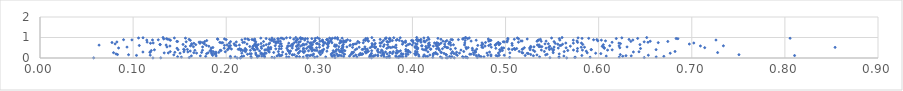
| Category | Series 0 |
|---|---|
| 0.2118543396008956 | 0.001 |
| 0.12129331327924464 | 0.002 |
| 0.21503471397023466 | 0.003 |
| 0.565711948898749 | 0.004 |
| 0.4317880717832856 | 0.005 |
| 0.057658690252793465 | 0.006 |
| 0.12973322363064155 | 0.007 |
| 0.44494189452631794 | 0.008 |
| 0.43621252997750537 | 0.009 |
| 0.2872661492622278 | 0.01 |
| 0.35607231722096055 | 0.011 |
| 0.547665336929914 | 0.012 |
| 0.4376710667148568 | 0.013 |
| 0.20470736708723236 | 0.014 |
| 0.4591225750260366 | 0.015 |
| 0.25174165239626 | 0.016 |
| 0.3168722514484781 | 0.017 |
| 0.21560596720742287 | 0.018 |
| 0.22693069176083858 | 0.019 |
| 0.16028587518891257 | 0.02 |
| 0.6489664209803414 | 0.021 |
| 0.4696963692293614 | 0.022 |
| 0.44119050889169076 | 0.023 |
| 0.3852339358780903 | 0.024 |
| 0.45463928858940317 | 0.025 |
| 0.3722078880253269 | 0.026 |
| 0.5044030828282321 | 0.027 |
| 0.375543780716866 | 0.028 |
| 0.5574835376465481 | 0.029 |
| 0.5743117218151931 | 0.03 |
| 0.4218886666890791 | 0.031 |
| 0.458367266610329 | 0.032 |
| 0.29505251293612056 | 0.033 |
| 0.5749159363888 | 0.034 |
| 0.24908869583206206 | 0.035 |
| 0.37386169035850947 | 0.036 |
| 0.5908239363297277 | 0.037 |
| 0.2334012408853079 | 0.038 |
| 0.3834502119157547 | 0.039 |
| 0.45692004560620847 | 0.04 |
| 0.15187447150669886 | 0.041 |
| 0.35392087247951287 | 0.042 |
| 0.6220308373638864 | 0.043 |
| 0.2827132019953973 | 0.044 |
| 0.24127367880391326 | 0.045 |
| 0.26483543574273616 | 0.046 |
| 0.3404484344927873 | 0.047 |
| 0.267339425217921 | 0.048 |
| 0.5574039925854366 | 0.049 |
| 0.430064651710236 | 0.05 |
| 0.30685046242236724 | 0.051 |
| 0.5365470671737739 | 0.052 |
| 0.661766917246885 | 0.053 |
| 0.4573908222730908 | 0.054 |
| 0.3894773188964096 | 0.055 |
| 0.20958990796429655 | 0.056 |
| 0.27529819331653327 | 0.057 |
| 0.4768359060287244 | 0.058 |
| 0.3695365599015791 | 0.059 |
| 0.38229908088392295 | 0.06 |
| 0.2164743538229993 | 0.061 |
| 0.14779102306572223 | 0.062 |
| 0.27869391100561847 | 0.063 |
| 0.4737805872930966 | 0.064 |
| 0.4538445014751191 | 0.065 |
| 0.29768051933521444 | 0.066 |
| 0.4424034812235781 | 0.067 |
| 0.326089384239017 | 0.068 |
| 0.31393656928011826 | 0.069 |
| 0.38763195198086153 | 0.07 |
| 0.2167980460928749 | 0.071 |
| 0.22653029826593363 | 0.072 |
| 0.35830620600344565 | 0.073 |
| 0.4117198485724607 | 0.074 |
| 0.4399375363958521 | 0.075 |
| 0.17793064280056137 | 0.076 |
| 0.4163260286040763 | 0.077 |
| 0.20449137725581024 | 0.078 |
| 0.4143998056783976 | 0.079 |
| 0.6699984778916008 | 0.08 |
| 0.47240549796858866 | 0.081 |
| 0.35475444166449377 | 0.082 |
| 0.625865923188232 | 0.083 |
| 0.2757556662461156 | 0.084 |
| 0.393139308548596 | 0.085 |
| 0.40705151198399014 | 0.086 |
| 0.3323216711928294 | 0.087 |
| 0.24110103758072388 | 0.088 |
| 0.23826304916578278 | 0.089 |
| 0.3369993350971824 | 0.09 |
| 0.23342595348156847 | 0.091 |
| 0.21873427063430262 | 0.092 |
| 0.6081212787012394 | 0.093 |
| 0.38595158758483505 | 0.094 |
| 0.5626463326287849 | 0.095 |
| 0.49150660873863383 | 0.096 |
| 0.25455172607005594 | 0.097 |
| 0.3198442079069719 | 0.098 |
| 0.1891810720723638 | 0.099 |
| 0.4843952945888166 | 0.1 |
| 0.1625535533919371 | 0.101 |
| 0.3821603532456097 | 0.102 |
| 0.1721913635535658 | 0.103 |
| 0.6349738761326968 | 0.104 |
| 0.3628253445918952 | 0.105 |
| 0.35789455986482965 | 0.106 |
| 0.23524600903118864 | 0.107 |
| 0.3543683382836095 | 0.108 |
| 0.2898174291139346 | 0.109 |
| 0.5299117922025715 | 0.11 |
| 0.25723303309405243 | 0.111 |
| 0.3236172762045092 | 0.112 |
| 0.37505210573846126 | 0.113 |
| 0.6293440779936227 | 0.114 |
| 0.3665946170845814 | 0.115 |
| 0.3132658259527399 | 0.116 |
| 0.28611369053828606 | 0.117 |
| 0.25871910428635414 | 0.118 |
| 0.4898300521821496 | 0.119 |
| 0.8104245322380949 | 0.12 |
| 0.4684155720918194 | 0.121 |
| 0.5210672285582073 | 0.122 |
| 0.5819549414660142 | 0.123 |
| 0.3163330221768246 | 0.124 |
| 0.29303874675957087 | 0.125 |
| 0.32029925702119544 | 0.126 |
| 0.18544649632331445 | 0.127 |
| 0.10363662358818748 | 0.128 |
| 0.44815748640613773 | 0.129 |
| 0.28769200164037745 | 0.13 |
| 0.35502570727339844 | 0.131 |
| 0.4809501080904858 | 0.132 |
| 0.3218587943080178 | 0.133 |
| 0.4985810579480795 | 0.134 |
| 0.6533526644686448 | 0.135 |
| 0.49328504403743334 | 0.136 |
| 0.3601719424604308 | 0.137 |
| 0.11836592431782622 | 0.138 |
| 0.25981026872816815 | 0.139 |
| 0.31578722535812187 | 0.14 |
| 0.3626902595369229 | 0.141 |
| 0.4710853164247998 | 0.142 |
| 0.4221650482163086 | 0.143 |
| 0.29110969492011574 | 0.144 |
| 0.36902509319119003 | 0.145 |
| 0.33906490913004483 | 0.146 |
| 0.41871571897624216 | 0.147 |
| 0.4034554597454654 | 0.148 |
| 0.5337129518742486 | 0.149 |
| 0.2708802190815446 | 0.15 |
| 0.5430577282656592 | 0.151 |
| 0.34309928049757576 | 0.152 |
| 0.14371731062860404 | 0.153 |
| 0.4125539109196724 | 0.154 |
| 0.48429152623243976 | 0.155 |
| 0.3424433179570746 | 0.156 |
| 0.2715661505727369 | 0.157 |
| 0.4365395572149465 | 0.158 |
| 0.27316463922471756 | 0.159 |
| 0.09512349751503746 | 0.16 |
| 0.23198192949283203 | 0.161 |
| 0.7506759277765156 | 0.162 |
| 0.355146923546272 | 0.163 |
| 0.406429275709397 | 0.164 |
| 0.3336786949623669 | 0.165 |
| 0.38931394896244254 | 0.166 |
| 0.6232384290556933 | 0.167 |
| 0.3012337005268172 | 0.168 |
| 0.08324735719887943 | 0.169 |
| 0.5270521191229725 | 0.17 |
| 0.34487234844147474 | 0.171 |
| 0.46596018112568327 | 0.172 |
| 0.24027175296618153 | 0.173 |
| 0.43575539564037147 | 0.174 |
| 0.4032244233575668 | 0.175 |
| 0.4469328848401162 | 0.176 |
| 0.3952090458239933 | 0.177 |
| 0.25646707010274683 | 0.178 |
| 0.24080419841961398 | 0.179 |
| 0.34474858988546453 | 0.18 |
| 0.22285965678385022 | 0.181 |
| 0.544668134275463 | 0.182 |
| 0.3265310698828966 | 0.183 |
| 0.32711842858838036 | 0.184 |
| 0.4628664548601116 | 0.185 |
| 0.461552469720134 | 0.186 |
| 0.18475843139095538 | 0.187 |
| 0.26437502999587004 | 0.188 |
| 0.3126987530467893 | 0.189 |
| 0.4267301487956935 | 0.19 |
| 0.34644181086551107 | 0.191 |
| 0.38998918133090965 | 0.192 |
| 0.3692468616635243 | 0.193 |
| 0.2937979869260713 | 0.194 |
| 0.3462580590749882 | 0.195 |
| 0.388329237874534 | 0.196 |
| 0.3931559160343776 | 0.197 |
| 0.08167685879381636 | 0.198 |
| 0.3728814523950059 | 0.199 |
| 0.5576371015980748 | 0.2 |
| 0.3185686043557513 | 0.201 |
| 0.36833275314720926 | 0.202 |
| 0.3445727274113227 | 0.203 |
| 0.4224345146573103 | 0.204 |
| 0.22689508594202124 | 0.205 |
| 0.18734298608181965 | 0.206 |
| 0.23833906262518956 | 0.207 |
| 0.1890284691611792 | 0.208 |
| 0.17891407095191125 | 0.209 |
| 0.2254322445255701 | 0.21 |
| 0.38823244003586266 | 0.211 |
| 0.33489779226302996 | 0.212 |
| 0.40236340373413637 | 0.213 |
| 0.602320517952807 | 0.214 |
| 0.52447829128767 | 0.215 |
| 0.4252033914872645 | 0.216 |
| 0.3784763875630589 | 0.217 |
| 0.2372253186847818 | 0.218 |
| 0.4446396135166958 | 0.219 |
| 0.268129338559272 | 0.22 |
| 0.36818589710159977 | 0.221 |
| 0.4417285548025798 | 0.222 |
| 0.4041900916686364 | 0.223 |
| 0.34405910195514666 | 0.224 |
| 0.42298898797966844 | 0.225 |
| 0.4338699071196207 | 0.226 |
| 0.35600115582467573 | 0.227 |
| 0.5232484778626111 | 0.228 |
| 0.27734697769458583 | 0.229 |
| 0.23785568032003612 | 0.23 |
| 0.3833018218464883 | 0.231 |
| 0.5967689641580967 | 0.232 |
| 0.6768462154781606 | 0.233 |
| 0.1504455817460465 | 0.234 |
| 0.40408830009348906 | 0.235 |
| 0.21672802094650956 | 0.236 |
| 0.24288783409144532 | 0.237 |
| 0.16816401833275096 | 0.238 |
| 0.2316675997314266 | 0.239 |
| 0.45048142766376764 | 0.24 |
| 0.48006950067616627 | 0.241 |
| 0.3500707141520074 | 0.242 |
| 0.4923925971662406 | 0.243 |
| 0.24148425387101713 | 0.244 |
| 0.31406390446077126 | 0.245 |
| 0.5185623129531752 | 0.246 |
| 0.18415466121840696 | 0.247 |
| 0.1377648480893946 | 0.248 |
| 0.13339854490350356 | 0.249 |
| 0.5046366554720813 | 0.25 |
| 0.38215328992590347 | 0.251 |
| 0.5877136403219607 | 0.252 |
| 0.46562132172189863 | 0.253 |
| 0.3831180188014738 | 0.254 |
| 0.33619532491752757 | 0.255 |
| 0.1805942214305445 | 0.256 |
| 0.3030394611420282 | 0.257 |
| 0.16519385946433696 | 0.258 |
| 0.5511593140739068 | 0.259 |
| 0.07897383145808656 | 0.26 |
| 0.3248984550739876 | 0.261 |
| 0.37588653306831044 | 0.262 |
| 0.3684436176028042 | 0.263 |
| 0.2998258666407998 | 0.264 |
| 0.2832915492777395 | 0.265 |
| 0.7277527403597487 | 0.266 |
| 0.4247982047307143 | 0.267 |
| 0.5175467094973271 | 0.268 |
| 0.2509746691140361 | 0.269 |
| 0.278012879459522 | 0.27 |
| 0.17356604799913333 | 0.271 |
| 0.4308563370651326 | 0.272 |
| 0.36544773732527536 | 0.273 |
| 0.4309510691485289 | 0.274 |
| 0.3350702809914343 | 0.275 |
| 0.19206829050649699 | 0.276 |
| 0.1448230272634189 | 0.277 |
| 0.37595583152538825 | 0.278 |
| 0.46778577078277916 | 0.279 |
| 0.397569741214857 | 0.28 |
| 0.4474153294542239 | 0.281 |
| 0.11801527977988724 | 0.282 |
| 0.3633098745614399 | 0.283 |
| 0.26059630269133294 | 0.284 |
| 0.11833768078380003 | 0.285 |
| 0.315947118644905 | 0.286 |
| 0.33679841011772227 | 0.287 |
| 0.1889670104782376 | 0.288 |
| 0.4828132814565702 | 0.289 |
| 0.24624506413098735 | 0.29 |
| 0.3512987021099927 | 0.291 |
| 0.1105471617451187 | 0.292 |
| 0.3710945552746634 | 0.293 |
| 0.6372973032955153 | 0.294 |
| 0.40511272097617135 | 0.295 |
| 0.1588317266717293 | 0.296 |
| 0.2679663486003888 | 0.297 |
| 0.3950800603606984 | 0.298 |
| 0.32334810413792403 | 0.299 |
| 0.34914716753044217 | 0.3 |
| 0.41668124508859683 | 0.301 |
| 0.15455089596208882 | 0.302 |
| 0.6433153235348629 | 0.303 |
| 0.44300608673765063 | 0.304 |
| 0.1990206197014156 | 0.305 |
| 0.22071573989267967 | 0.306 |
| 0.18625259221513402 | 0.307 |
| 0.37937911194497653 | 0.308 |
| 0.30064131868713573 | 0.309 |
| 0.13987618663091939 | 0.31 |
| 0.3852060938908851 | 0.311 |
| 0.32183509416178624 | 0.312 |
| 0.5629692968841183 | 0.313 |
| 0.2559908221721603 | 0.314 |
| 0.35152236105320267 | 0.315 |
| 0.4550995632695559 | 0.316 |
| 0.30095921306794315 | 0.317 |
| 0.3501197029841884 | 0.318 |
| 0.6820095067855417 | 0.319 |
| 0.5416584730208279 | 0.32 |
| 0.5313304508332922 | 0.321 |
| 0.4676264874575027 | 0.322 |
| 0.5146727574005961 | 0.323 |
| 0.26696040744917515 | 0.324 |
| 0.2820395341027825 | 0.325 |
| 0.28444687993071394 | 0.326 |
| 0.3526974880446103 | 0.327 |
| 0.4942817220864565 | 0.328 |
| 0.3177673349916773 | 0.329 |
| 0.40328744412561046 | 0.33 |
| 0.5867196805103992 | 0.331 |
| 0.30810880037046307 | 0.332 |
| 0.2674634079949054 | 0.333 |
| 0.5770607995393475 | 0.334 |
| 0.39297021909963714 | 0.335 |
| 0.27934379039840296 | 0.336 |
| 0.3952318648110773 | 0.337 |
| 0.3935124053111958 | 0.338 |
| 0.16135306818278794 | 0.339 |
| 0.2690934072766944 | 0.34 |
| 0.24537906082527816 | 0.341 |
| 0.2921072114089638 | 0.342 |
| 0.23583039078131918 | 0.343 |
| 0.3239197780069777 | 0.344 |
| 0.39567617865379245 | 0.345 |
| 0.32302236080417346 | 0.346 |
| 0.36760765983210586 | 0.347 |
| 0.18317385849541123 | 0.348 |
| 0.2883818037506717 | 0.349 |
| 0.32443023983431984 | 0.35 |
| 0.3870841512910468 | 0.351 |
| 0.3037231365763984 | 0.352 |
| 0.3274652601859168 | 0.353 |
| 0.3623540910122891 | 0.354 |
| 0.46725010294655056 | 0.355 |
| 0.3562422815691232 | 0.356 |
| 0.5510423656113967 | 0.357 |
| 0.3149384075964734 | 0.358 |
| 0.1840512705341002 | 0.359 |
| 0.18281763248888794 | 0.36 |
| 0.11953798958363004 | 0.361 |
| 0.38331261559266205 | 0.362 |
| 0.19447024387402456 | 0.363 |
| 0.49661575569030636 | 0.364 |
| 0.21765323294532435 | 0.365 |
| 0.2975205684033897 | 0.366 |
| 0.5668326367055361 | 0.367 |
| 0.21940548274286242 | 0.368 |
| 0.21552219837031839 | 0.369 |
| 0.2953689517530488 | 0.37 |
| 0.30299778924710696 | 0.371 |
| 0.32625229039619286 | 0.372 |
| 0.39520281269940694 | 0.373 |
| 0.16633562718311345 | 0.374 |
| 0.22593329688308128 | 0.375 |
| 0.4290251169155572 | 0.376 |
| 0.17452116152105013 | 0.377 |
| 0.19353636316902734 | 0.378 |
| 0.5297317795386467 | 0.379 |
| 0.41458297306342407 | 0.38 |
| 0.2927110057021941 | 0.381 |
| 0.3667911385260244 | 0.382 |
| 0.4645459219312771 | 0.383 |
| 0.6095706134965531 | 0.384 |
| 0.45211521414280087 | 0.385 |
| 0.5825627150985614 | 0.386 |
| 0.5384632005730391 | 0.387 |
| 0.5729415459328827 | 0.388 |
| 0.2751783376160065 | 0.389 |
| 0.24140357550150027 | 0.39 |
| 0.22993837641665726 | 0.391 |
| 0.26601377279242455 | 0.392 |
| 0.23112447895598143 | 0.393 |
| 0.22164986335838321 | 0.394 |
| 0.1550681959820075 | 0.395 |
| 0.4124873159137584 | 0.396 |
| 0.6145120204281461 | 0.397 |
| 0.24251978261184393 | 0.398 |
| 0.12289335552397873 | 0.399 |
| 0.29424866280011897 | 0.4 |
| 0.2014211809065749 | 0.401 |
| 0.33860259463149167 | 0.402 |
| 0.148336852291317 | 0.403 |
| 0.5263986333013577 | 0.404 |
| 0.4936681001478769 | 0.405 |
| 0.5919295850316278 | 0.406 |
| 0.6616770511730389 | 0.407 |
| 0.31844633598786687 | 0.408 |
| 0.5516131953652824 | 0.409 |
| 0.5921744187185158 | 0.41 |
| 0.3204699281963259 | 0.411 |
| 0.547157108142369 | 0.412 |
| 0.5071529286695311 | 0.413 |
| 0.5102253679043048 | 0.414 |
| 0.24405087224873323 | 0.415 |
| 0.345990744143414 | 0.416 |
| 0.3928505705944312 | 0.417 |
| 0.15830940098557567 | 0.418 |
| 0.36287351738535245 | 0.419 |
| 0.2160441169185675 | 0.42 |
| 0.4284356654273648 | 0.421 |
| 0.21290313885544865 | 0.422 |
| 0.5178470820852958 | 0.423 |
| 0.15422768855637292 | 0.424 |
| 0.4194391861496447 | 0.425 |
| 0.24567846644490843 | 0.426 |
| 0.30468725160197496 | 0.427 |
| 0.44100274056833855 | 0.428 |
| 0.4106916216697998 | 0.429 |
| 0.4052418766380924 | 0.43 |
| 0.347119734858932 | 0.431 |
| 0.3515262736094493 | 0.432 |
| 0.4690192962566171 | 0.433 |
| 0.2829565992706382 | 0.434 |
| 0.503490897785625 | 0.435 |
| 0.41986225667348576 | 0.436 |
| 0.2335896433795066 | 0.437 |
| 0.20556788574920293 | 0.438 |
| 0.24781438227894725 | 0.439 |
| 0.2766640905172906 | 0.44 |
| 0.5035229911901753 | 0.441 |
| 0.4048969007979859 | 0.442 |
| 0.5186429585060918 | 0.443 |
| 0.29065935466448034 | 0.444 |
| 0.25321730820365307 | 0.445 |
| 0.340268415840563 | 0.446 |
| 0.25692418462940925 | 0.447 |
| 0.34941116209495526 | 0.448 |
| 0.4258699628072239 | 0.449 |
| 0.458002226212446 | 0.45 |
| 0.3239148344307968 | 0.451 |
| 0.4959588840865744 | 0.452 |
| 0.43221840631669617 | 0.453 |
| 0.22928575334332513 | 0.454 |
| 0.25905033140905154 | 0.455 |
| 0.21441232736585103 | 0.456 |
| 0.509312172206567 | 0.457 |
| 0.5493431308325172 | 0.458 |
| 0.5096136217327809 | 0.459 |
| 0.28623950601121073 | 0.46 |
| 0.5119917752272912 | 0.461 |
| 0.41466806932181977 | 0.462 |
| 0.6449734933098521 | 0.463 |
| 0.220440243361954 | 0.464 |
| 0.5772486405949415 | 0.465 |
| 0.24634951665646843 | 0.466 |
| 0.27786037313927114 | 0.467 |
| 0.4461497241299264 | 0.468 |
| 0.372454943965866 | 0.469 |
| 0.2379657718087239 | 0.47 |
| 0.2025516645591705 | 0.471 |
| 0.2281047363000942 | 0.472 |
| 0.4895772688072898 | 0.473 |
| 0.4643564791576409 | 0.474 |
| 0.28301088428443255 | 0.475 |
| 0.6060293076466241 | 0.476 |
| 0.14715954548856847 | 0.477 |
| 0.19780443411068838 | 0.478 |
| 0.29145214070109093 | 0.479 |
| 0.5435234330802357 | 0.48 |
| 0.3248125247142263 | 0.481 |
| 0.2650996252571951 | 0.482 |
| 0.27094952272125483 | 0.483 |
| 0.5566308141322691 | 0.484 |
| 0.18384147164307396 | 0.485 |
| 0.4058286616607468 | 0.486 |
| 0.5258501989024756 | 0.487 |
| 0.4278059991524602 | 0.488 |
| 0.08440568783947555 | 0.489 |
| 0.49800791628034324 | 0.49 |
| 0.20365427471407316 | 0.491 |
| 0.29054065151887176 | 0.492 |
| 0.4159104885473013 | 0.493 |
| 0.3600257889570261 | 0.494 |
| 0.2921698998238139 | 0.495 |
| 0.3087285032025152 | 0.496 |
| 0.5650528882388373 | 0.497 |
| 0.605985615304358 | 0.498 |
| 0.6227266696009569 | 0.499 |
| 0.2969901045052922 | 0.5 |
| 0.5201846822093263 | 0.501 |
| 0.49599977621018077 | 0.502 |
| 0.3545883568949909 | 0.503 |
| 0.7138963054992405 | 0.504 |
| 0.43802071196320824 | 0.505 |
| 0.3824101829359694 | 0.506 |
| 0.3767544040859707 | 0.507 |
| 0.45984350824140996 | 0.508 |
| 0.43696526675384006 | 0.509 |
| 0.4756961901968211 | 0.51 |
| 0.18569014502198256 | 0.511 |
| 0.40293638640951746 | 0.512 |
| 0.3251465336719569 | 0.513 |
| 0.23280517090568686 | 0.514 |
| 0.4575678862096658 | 0.515 |
| 0.6053531496130351 | 0.516 |
| 0.24785538659047168 | 0.517 |
| 0.8539166534264081 | 0.518 |
| 0.33566554156925177 | 0.519 |
| 0.527217839888932 | 0.52 |
| 0.5464598750701768 | 0.521 |
| 0.24529829698779915 | 0.522 |
| 0.37417901536754106 | 0.523 |
| 0.5812652639230885 | 0.524 |
| 0.584785399285711 | 0.525 |
| 0.3428034578872837 | 0.526 |
| 0.3001891945931313 | 0.527 |
| 0.4846647997429556 | 0.528 |
| 0.47452523879173314 | 0.529 |
| 0.3750069725088263 | 0.53 |
| 0.41769013649435494 | 0.531 |
| 0.09345245922555734 | 0.532 |
| 0.5521473350403856 | 0.533 |
| 0.4031533064834074 | 0.534 |
| 0.3788260631517315 | 0.535 |
| 0.36060797096352015 | 0.536 |
| 0.380506706802224 | 0.537 |
| 0.35904458839946285 | 0.538 |
| 0.17462763664314918 | 0.539 |
| 0.1363686237548295 | 0.54 |
| 0.6304731299714265 | 0.541 |
| 0.32961095700998266 | 0.542 |
| 0.34897678137828403 | 0.543 |
| 0.2879986325754871 | 0.544 |
| 0.3562861577656917 | 0.545 |
| 0.5305425522619415 | 0.546 |
| 0.16479428824370823 | 0.547 |
| 0.23764325217512272 | 0.548 |
| 0.434519180724674 | 0.549 |
| 0.5360371114799408 | 0.55 |
| 0.3209807413163188 | 0.551 |
| 0.4353228476718588 | 0.552 |
| 0.2904630674092671 | 0.553 |
| 0.5390209247975177 | 0.554 |
| 0.23219286417166896 | 0.555 |
| 0.40283296473330277 | 0.556 |
| 0.5372736898504656 | 0.557 |
| 0.2894167675082736 | 0.558 |
| 0.4043718266407924 | 0.559 |
| 0.15632442877155694 | 0.56 |
| 0.22532010750428955 | 0.561 |
| 0.2755867488253866 | 0.562 |
| 0.36891381458570904 | 0.563 |
| 0.26624584130579554 | 0.564 |
| 0.4143600153387791 | 0.565 |
| 0.31771849375156924 | 0.566 |
| 0.5269793593822053 | 0.567 |
| 0.22866774006499124 | 0.568 |
| 0.6038161267917294 | 0.569 |
| 0.257096909712326 | 0.57 |
| 0.20285415799639184 | 0.571 |
| 0.5474982653794148 | 0.572 |
| 0.18136980452502072 | 0.573 |
| 0.3253924614474305 | 0.574 |
| 0.25953498117286056 | 0.575 |
| 0.5695823040166305 | 0.576 |
| 0.3094986385327906 | 0.577 |
| 0.3162812864021828 | 0.578 |
| 0.4224939295869913 | 0.579 |
| 0.279778348287153 | 0.58 |
| 0.23219739225588854 | 0.581 |
| 0.4780406207248723 | 0.582 |
| 0.27563700247813017 | 0.583 |
| 0.13955184619952077 | 0.584 |
| 0.3655090246090078 | 0.585 |
| 0.42677309820294085 | 0.586 |
| 0.709262872927234 | 0.587 |
| 0.27107784683314917 | 0.588 |
| 0.6219612318016587 | 0.589 |
| 0.40985530385831836 | 0.59 |
| 0.1615121414802121 | 0.591 |
| 0.2660874883039338 | 0.592 |
| 0.26876825365628976 | 0.593 |
| 0.7339653909098109 | 0.594 |
| 0.42574339785516535 | 0.595 |
| 0.3933936216603663 | 0.596 |
| 0.611917610954376 | 0.597 |
| 0.41035555421889314 | 0.598 |
| 0.42673020525791405 | 0.599 |
| 0.25257354357417794 | 0.6 |
| 0.32487103739727896 | 0.601 |
| 0.21069493452841737 | 0.602 |
| 0.24014950732934948 | 0.603 |
| 0.20456758297018585 | 0.604 |
| 0.22944852690054596 | 0.605 |
| 0.4819024149624762 | 0.606 |
| 0.41721810262848436 | 0.607 |
| 0.27696960113261815 | 0.608 |
| 0.3039895983206452 | 0.609 |
| 0.3327732963219867 | 0.61 |
| 0.10663915641360933 | 0.611 |
| 0.558308556551875 | 0.612 |
| 0.17867279707144945 | 0.613 |
| 0.5595030628699514 | 0.614 |
| 0.47017604590861073 | 0.615 |
| 0.2919342718685686 | 0.616 |
| 0.19807319823408465 | 0.617 |
| 0.4742251830915545 | 0.618 |
| 0.5071338011426825 | 0.619 |
| 0.23273863922896498 | 0.62 |
| 0.48904922459196476 | 0.621 |
| 0.31851192445395915 | 0.622 |
| 0.4412359307003022 | 0.623 |
| 0.35678054985607544 | 0.624 |
| 0.2318564107534714 | 0.625 |
| 0.2817490308531555 | 0.626 |
| 0.418656056739825 | 0.627 |
| 0.06345498128680505 | 0.628 |
| 0.2091328291942549 | 0.629 |
| 0.3824124969830912 | 0.63 |
| 0.21412813126304064 | 0.631 |
| 0.23286066187838705 | 0.632 |
| 0.1354720328798511 | 0.633 |
| 0.5342255158543594 | 0.634 |
| 0.16273153966905995 | 0.635 |
| 0.39975839704319927 | 0.636 |
| 0.33322327334665003 | 0.637 |
| 0.45592341486278165 | 0.638 |
| 0.20097213206031372 | 0.639 |
| 0.488943587168405 | 0.64 |
| 0.2839198796322816 | 0.641 |
| 0.5359839140873031 | 0.642 |
| 0.31671549699105106 | 0.643 |
| 0.4929419141555207 | 0.644 |
| 0.444051637367747 | 0.645 |
| 0.373282089738864 | 0.646 |
| 0.6050285828087038 | 0.647 |
| 0.36971326976621743 | 0.648 |
| 0.12906911684390399 | 0.649 |
| 0.24295863016027253 | 0.65 |
| 0.16724472204370966 | 0.651 |
| 0.2343417778924558 | 0.652 |
| 0.6443757441882451 | 0.653 |
| 0.23098122460735548 | 0.654 |
| 0.300039026395141 | 0.655 |
| 0.35931924954050287 | 0.656 |
| 0.39535055827749765 | 0.657 |
| 0.3364492117513225 | 0.658 |
| 0.42886926867929076 | 0.659 |
| 0.4837862948898012 | 0.66 |
| 0.5829244621157256 | 0.661 |
| 0.15364476518431014 | 0.662 |
| 0.12892068626966235 | 0.663 |
| 0.2713976902113324 | 0.664 |
| 0.2926516587255903 | 0.665 |
| 0.2709041905577173 | 0.666 |
| 0.3258203634523097 | 0.667 |
| 0.3362878899969257 | 0.668 |
| 0.47566820226532514 | 0.669 |
| 0.3090703385552226 | 0.67 |
| 0.5612499970006486 | 0.671 |
| 0.27765263419501884 | 0.672 |
| 0.3892585812209397 | 0.673 |
| 0.2826427950785586 | 0.674 |
| 0.5560908573928419 | 0.675 |
| 0.49305992069631166 | 0.676 |
| 0.43461459295285787 | 0.677 |
| 0.24566586681200264 | 0.678 |
| 0.2860420083785695 | 0.679 |
| 0.30833231555935037 | 0.68 |
| 0.6973868171031966 | 0.681 |
| 0.39718800755682204 | 0.682 |
| 0.40499491704857526 | 0.683 |
| 0.2223484161506033 | 0.684 |
| 0.17654273539845877 | 0.685 |
| 0.4250440307808101 | 0.686 |
| 0.3383646679929704 | 0.687 |
| 0.5423786132046141 | 0.688 |
| 0.0806852527421541 | 0.689 |
| 0.2581158493881346 | 0.69 |
| 0.25904581063425847 | 0.691 |
| 0.4389658424149826 | 0.692 |
| 0.5459617656713396 | 0.693 |
| 0.4172300154766141 | 0.694 |
| 0.40343625790717974 | 0.695 |
| 0.20851337778118006 | 0.696 |
| 0.2310191593022637 | 0.697 |
| 0.1628816491145335 | 0.698 |
| 0.49033704687761903 | 0.699 |
| 0.3398375750773881 | 0.7 |
| 0.6234323239338154 | 0.701 |
| 0.49419082567822803 | 0.702 |
| 0.356610910935958 | 0.703 |
| 0.304906138804095 | 0.704 |
| 0.2968948098291849 | 0.705 |
| 0.4259080089576659 | 0.706 |
| 0.23744142722801664 | 0.707 |
| 0.2904052587427368 | 0.708 |
| 0.506947382191418 | 0.709 |
| 0.29810687633832567 | 0.71 |
| 0.427752739822006 | 0.711 |
| 0.360049316261862 | 0.712 |
| 0.30990395878111077 | 0.713 |
| 0.25349772500656476 | 0.714 |
| 0.5533735258053332 | 0.715 |
| 0.2901446873654986 | 0.716 |
| 0.17183305576062513 | 0.717 |
| 0.11865068319113259 | 0.718 |
| 0.1652649606777321 | 0.719 |
| 0.20327851087345494 | 0.72 |
| 0.3661741943227099 | 0.721 |
| 0.4306132667157252 | 0.722 |
| 0.5728282247589794 | 0.723 |
| 0.2671786219185317 | 0.724 |
| 0.6217550587491105 | 0.725 |
| 0.2466860497907648 | 0.726 |
| 0.3218131218962349 | 0.727 |
| 0.5647351266608447 | 0.728 |
| 0.5815107032032145 | 0.729 |
| 0.36506355923086675 | 0.73 |
| 0.7021877520492114 | 0.731 |
| 0.29058336014625363 | 0.732 |
| 0.45622357196302643 | 0.733 |
| 0.12156370053295285 | 0.734 |
| 0.4406838576572999 | 0.735 |
| 0.3096629945789361 | 0.736 |
| 0.4236937582414514 | 0.737 |
| 0.47472718166743044 | 0.738 |
| 0.41797564274448995 | 0.739 |
| 0.291241214142564 | 0.74 |
| 0.19461420982187938 | 0.741 |
| 0.3135285336890704 | 0.742 |
| 0.30624174934427295 | 0.743 |
| 0.347151657980025 | 0.744 |
| 0.49248576447064196 | 0.745 |
| 0.27301007225076224 | 0.746 |
| 0.19622223223055457 | 0.747 |
| 0.1749133447805118 | 0.748 |
| 0.663986833502377 | 0.749 |
| 0.42625231791405627 | 0.75 |
| 0.3098475344261167 | 0.751 |
| 0.44023063636927817 | 0.752 |
| 0.34280771023265877 | 0.753 |
| 0.40091528186477277 | 0.754 |
| 0.07732228696717869 | 0.755 |
| 0.478497139042638 | 0.756 |
| 0.2557993251770402 | 0.757 |
| 0.39057028398380644 | 0.758 |
| 0.21781245722019005 | 0.759 |
| 0.49216518609999094 | 0.76 |
| 0.39256097476969687 | 0.761 |
| 0.5774242622968792 | 0.762 |
| 0.19311927433313758 | 0.763 |
| 0.3261098600203438 | 0.764 |
| 0.21956264344160392 | 0.765 |
| 0.3231709071863311 | 0.766 |
| 0.6144043263689181 | 0.767 |
| 0.6529797204172676 | 0.768 |
| 0.5138318063001525 | 0.769 |
| 0.4091795517578677 | 0.77 |
| 0.3672364827234764 | 0.771 |
| 0.1725221924114856 | 0.772 |
| 0.4396811063769278 | 0.773 |
| 0.27531890670042325 | 0.774 |
| 0.11506823526364485 | 0.775 |
| 0.17087930361301773 | 0.776 |
| 0.37435424596573985 | 0.777 |
| 0.2937583686047589 | 0.778 |
| 0.2780511838737325 | 0.779 |
| 0.25288430542890505 | 0.78 |
| 0.41352960914968806 | 0.781 |
| 0.08259583655027414 | 0.782 |
| 0.2108245490521753 | 0.783 |
| 0.5016337077625475 | 0.784 |
| 0.4986884475162866 | 0.785 |
| 0.2317410293205342 | 0.786 |
| 0.32850659333423526 | 0.787 |
| 0.6488729171856473 | 0.788 |
| 0.2536021379794752 | 0.789 |
| 0.49749410921769033 | 0.79 |
| 0.1569758137757138 | 0.791 |
| 0.28767897566895706 | 0.792 |
| 0.30421185669746886 | 0.793 |
| 0.32647332368419557 | 0.794 |
| 0.2794167787695587 | 0.795 |
| 0.37271763189088136 | 0.796 |
| 0.3730134359139662 | 0.797 |
| 0.5520959275329229 | 0.798 |
| 0.20463975555058322 | 0.799 |
| 0.43550351777072727 | 0.8 |
| 0.24008000341111546 | 0.801 |
| 0.17689954310601153 | 0.802 |
| 0.2509670199820758 | 0.803 |
| 0.14774136727944265 | 0.804 |
| 0.3413408117677289 | 0.805 |
| 0.30347287446532467 | 0.806 |
| 0.6742837437080861 | 0.807 |
| 0.3099338836052372 | 0.808 |
| 0.3237840946066636 | 0.809 |
| 0.6345613261903132 | 0.81 |
| 0.1470017194037968 | 0.811 |
| 0.2556946818453659 | 0.812 |
| 0.41244086928930324 | 0.813 |
| 0.40571308498220715 | 0.814 |
| 0.5337959106426505 | 0.815 |
| 0.3006323644350438 | 0.816 |
| 0.5382738357157533 | 0.817 |
| 0.6553677223927361 | 0.818 |
| 0.2580766756385895 | 0.819 |
| 0.38882228708800814 | 0.82 |
| 0.43276713910883857 | 0.821 |
| 0.3525991099182547 | 0.822 |
| 0.5435527717742734 | 0.823 |
| 0.3127113747717878 | 0.824 |
| 0.4630212695497894 | 0.825 |
| 0.48189305637140445 | 0.826 |
| 0.39261535233020184 | 0.827 |
| 0.3120399331849474 | 0.828 |
| 0.37623515569954136 | 0.829 |
| 0.35255865387812857 | 0.83 |
| 0.5177795940429022 | 0.831 |
| 0.5164718340562202 | 0.832 |
| 0.2950024176572871 | 0.833 |
| 0.5767106932451267 | 0.834 |
| 0.6073464814391104 | 0.835 |
| 0.5019340906182304 | 0.836 |
| 0.41249478279318574 | 0.837 |
| 0.3031152589393302 | 0.838 |
| 0.5990651120604524 | 0.839 |
| 0.2306371817131736 | 0.84 |
| 0.4824975612481285 | 0.841 |
| 0.32610757748914254 | 0.842 |
| 0.27494322079830225 | 0.843 |
| 0.32860187942518926 | 0.844 |
| 0.40053537745404466 | 0.845 |
| 0.3223959725093749 | 0.846 |
| 0.36881445900449483 | 0.847 |
| 0.3330524040539511 | 0.848 |
| 0.4369775960997039 | 0.849 |
| 0.17906128027361612 | 0.85 |
| 0.3784206135202056 | 0.851 |
| 0.4565528176783088 | 0.852 |
| 0.3990578958853973 | 0.853 |
| 0.34942023264655986 | 0.854 |
| 0.2482648872019242 | 0.855 |
| 0.29563431497756 | 0.856 |
| 0.5345864063033681 | 0.857 |
| 0.4842744554309354 | 0.858 |
| 0.38583803031662034 | 0.859 |
| 0.4071565730338982 | 0.86 |
| 0.16145849664399214 | 0.861 |
| 0.41542001812291574 | 0.862 |
| 0.4836141950212205 | 0.863 |
| 0.3587203758022671 | 0.864 |
| 0.382602632250268 | 0.865 |
| 0.1401016826101863 | 0.866 |
| 0.3477480087653383 | 0.867 |
| 0.4684516407098348 | 0.868 |
| 0.4084348824312666 | 0.869 |
| 0.6029159512028438 | 0.87 |
| 0.572739450398722 | 0.871 |
| 0.5583250255947738 | 0.872 |
| 0.11468607055675184 | 0.873 |
| 0.24933640495680653 | 0.874 |
| 0.2842978299084127 | 0.875 |
| 0.7259906750358547 | 0.876 |
| 0.303458822721563 | 0.877 |
| 0.6367618509352698 | 0.878 |
| 0.12081780379359397 | 0.879 |
| 0.22915127910097643 | 0.88 |
| 0.5355728120185819 | 0.881 |
| 0.3513325287070165 | 0.882 |
| 0.09872807568844699 | 0.883 |
| 0.4062078153067079 | 0.884 |
| 0.21681556601163943 | 0.885 |
| 0.4043920849999503 | 0.886 |
| 0.12700734211554388 | 0.887 |
| 0.5945407385314623 | 0.888 |
| 0.3302516207068452 | 0.889 |
| 0.4429826599736949 | 0.89 |
| 0.2242788646451871 | 0.891 |
| 0.13912523349586892 | 0.892 |
| 0.08975205845623879 | 0.893 |
| 0.308706482783897 | 0.894 |
| 0.19998831614509938 | 0.895 |
| 0.3078858964192178 | 0.896 |
| 0.4493726340448885 | 0.897 |
| 0.5980368864896953 | 0.898 |
| 0.3082351825552838 | 0.899 |
| 0.4414776517730373 | 0.9 |
| 0.2763378445306429 | 0.901 |
| 0.4046305910645962 | 0.902 |
| 0.22771391040210154 | 0.903 |
| 0.4090810279069055 | 0.904 |
| 0.3836220778065641 | 0.905 |
| 0.632616823413949 | 0.906 |
| 0.16012340703129324 | 0.907 |
| 0.36535674311472033 | 0.908 |
| 0.19093185278300406 | 0.909 |
| 0.25165905918936426 | 0.91 |
| 0.4306381906341261 | 0.911 |
| 0.24655149206648985 | 0.912 |
| 0.4177596722278657 | 0.913 |
| 0.5094200851346176 | 0.914 |
| 0.5374149099072945 | 0.915 |
| 0.2765449463286147 | 0.916 |
| 0.1372425280876406 | 0.917 |
| 0.2804614102466926 | 0.918 |
| 0.5025004762705882 | 0.919 |
| 0.27247597124017287 | 0.92 |
| 0.23066069454156346 | 0.921 |
| 0.3197284010098007 | 0.922 |
| 0.3760727983112446 | 0.923 |
| 0.31255518821160033 | 0.924 |
| 0.45392390453331544 | 0.925 |
| 0.22303646583868664 | 0.926 |
| 0.5232509852313065 | 0.927 |
| 0.2618962701119165 | 0.928 |
| 0.4814961250355848 | 0.929 |
| 0.132903004632561 | 0.93 |
| 0.19815297042150748 | 0.931 |
| 0.2561594805197732 | 0.932 |
| 0.19061034813897137 | 0.933 |
| 0.3709621764854907 | 0.934 |
| 0.37511156146308544 | 0.935 |
| 0.2202604277504432 | 0.936 |
| 0.3000275661084688 | 0.937 |
| 0.5139930228087505 | 0.938 |
| 0.25532152759307647 | 0.939 |
| 0.45925006149250147 | 0.94 |
| 0.6850916527571037 | 0.941 |
| 0.13590995711980447 | 0.942 |
| 0.2872712001149803 | 0.943 |
| 0.29194640333306976 | 0.944 |
| 0.5577402772952067 | 0.945 |
| 0.28493447275911166 | 0.946 |
| 0.2822820451083199 | 0.947 |
| 0.6189261622642915 | 0.948 |
| 0.45472042774761123 | 0.949 |
| 0.24287808330406535 | 0.95 |
| 0.6831882434926584 | 0.951 |
| 0.3497812347117051 | 0.952 |
| 0.5024345945579687 | 0.953 |
| 0.29564226351850253 | 0.954 |
| 0.6418862272154804 | 0.955 |
| 0.3516923952911867 | 0.956 |
| 0.5821425565418891 | 0.957 |
| 0.2601944785150878 | 0.958 |
| 0.5892962353480933 | 0.959 |
| 0.42737104231615786 | 0.96 |
| 0.31402702414318995 | 0.961 |
| 0.37559837504563565 | 0.962 |
| 0.805593580038896 | 0.963 |
| 0.28117107874349556 | 0.964 |
| 0.37108681546504074 | 0.965 |
| 0.3244844790928568 | 0.966 |
| 0.27942464734875383 | 0.967 |
| 0.15621640776605838 | 0.968 |
| 0.23715234144169817 | 0.969 |
| 0.31099602080562183 | 0.97 |
| 0.316591601480116 | 0.971 |
| 0.25889846712035247 | 0.972 |
| 0.2491436929663312 | 0.973 |
| 0.5494401402269932 | 0.974 |
| 0.3719304909259189 | 0.975 |
| 0.1443071793194448 | 0.976 |
| 0.10585540614873667 | 0.977 |
| 0.5126639395319929 | 0.978 |
| 0.41231398876537395 | 0.979 |
| 0.4610303270530941 | 0.98 |
| 0.31733424591203097 | 0.981 |
| 0.5778732974801157 | 0.982 |
| 0.6248756171265276 | 0.983 |
| 0.2646790002491678 | 0.984 |
| 0.27956904657770854 | 0.985 |
| 0.3868646488779447 | 0.986 |
| 0.11066340698733756 | 0.987 |
| 0.3799667312309932 | 0.988 |
| 0.2686274247682646 | 0.989 |
| 0.3195035173212989 | 0.99 |
| 0.2980099167618877 | 0.991 |
| 0.45737403521715825 | 0.992 |
| 0.4567610976247449 | 0.993 |
| 0.3564351997356081 | 0.994 |
| 0.4167563651620524 | 0.995 |
| 0.6516343035118245 | 0.996 |
| 0.5606863987188798 | 0.997 |
| 0.2747123641914868 | 0.998 |
| 0.13215955067529717 | 0.999 |
| 0.4045618327869619 | 1 |